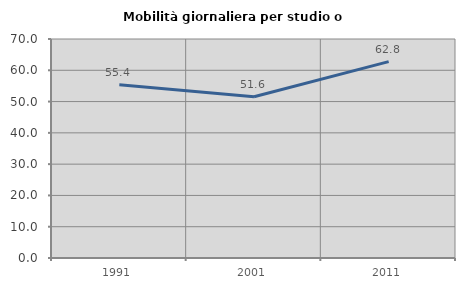
| Category | Mobilità giornaliera per studio o lavoro |
|---|---|
| 1991.0 | 55.405 |
| 2001.0 | 51.556 |
| 2011.0 | 62.78 |